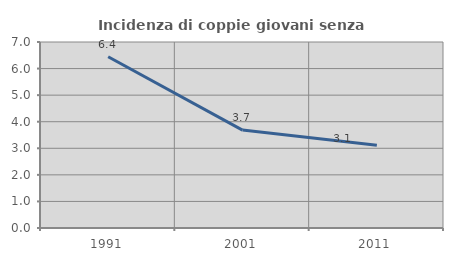
| Category | Incidenza di coppie giovani senza figli |
|---|---|
| 1991.0 | 6.443 |
| 2001.0 | 3.685 |
| 2011.0 | 3.114 |